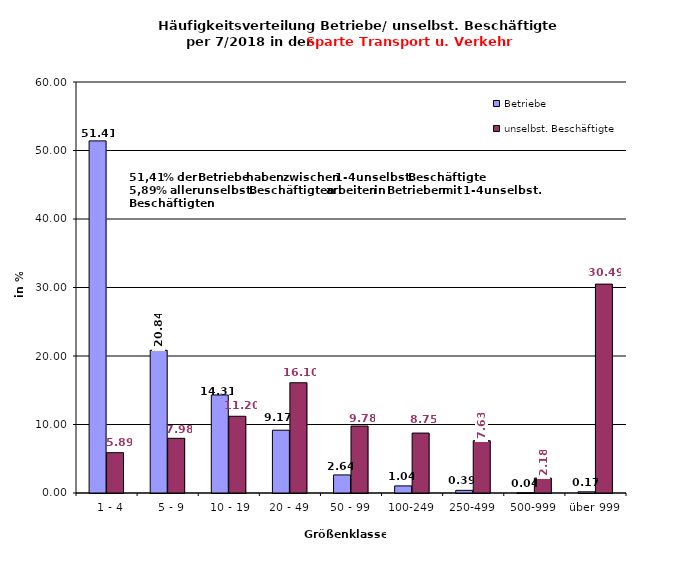
| Category | Betriebe | unselbst. Beschäftigte |
|---|---|---|
|   1 - 4 | 51.405 | 5.886 |
|   5 - 9 | 20.839 | 7.985 |
|  10 - 19 | 14.31 | 11.201 |
| 20 - 49 | 9.166 | 16.096 |
| 50 - 99 | 2.637 | 9.775 |
| 100-249 | 1.038 | 8.75 |
| 250-499 | 0.389 | 7.635 |
| 500-999 | 0.043 | 2.178 |
| über 999 | 0.173 | 30.494 |